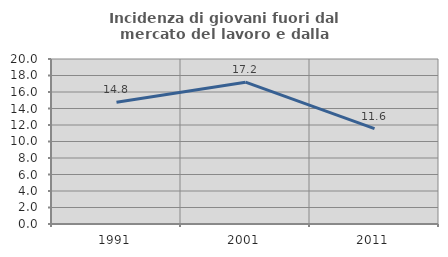
| Category | Incidenza di giovani fuori dal mercato del lavoro e dalla formazione  |
|---|---|
| 1991.0 | 14.754 |
| 2001.0 | 17.188 |
| 2011.0 | 11.57 |